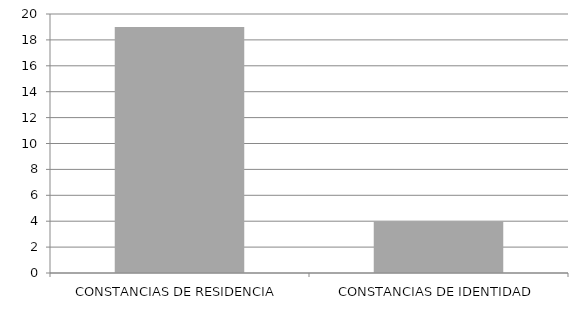
| Category | Series 0 |
|---|---|
| CONSTANCIAS DE RESIDENCIA | 19 |
| CONSTANCIAS DE IDENTIDAD | 4 |